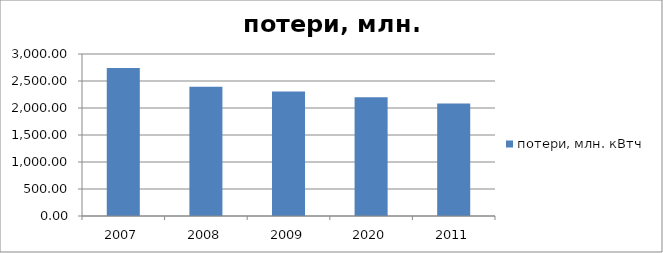
| Category | потери, млн. кВтч |
|---|---|
| 0 | 2741.831 |
| 1 | 2393.751 |
| 2 | 2305.626 |
| 3 | 2197.331 |
| 4 | 2083.448 |